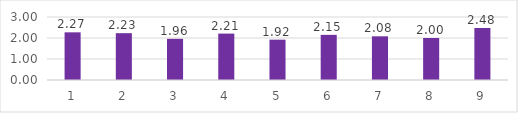
| Category | Series 0 |
|---|---|
| 0 | 2.27 |
| 1 | 2.23 |
| 2 | 1.96 |
| 3 | 2.21 |
| 4 | 1.92 |
| 5 | 2.15 |
| 6 | 2.08 |
| 7 | 2 |
| 8 | 2.48 |